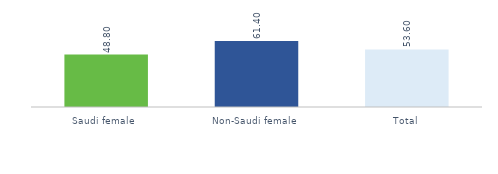
| Category | Series 0 |
|---|---|
| Saudi female  | 48.8 |
| Non-Saudi female | 61.4 |
| Total | 53.6 |